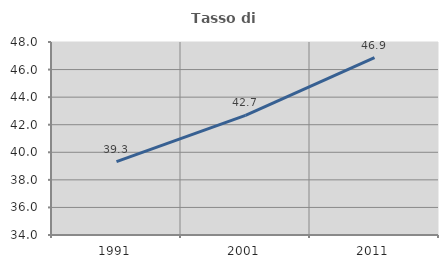
| Category | Tasso di occupazione   |
|---|---|
| 1991.0 | 39.316 |
| 2001.0 | 42.671 |
| 2011.0 | 46.875 |